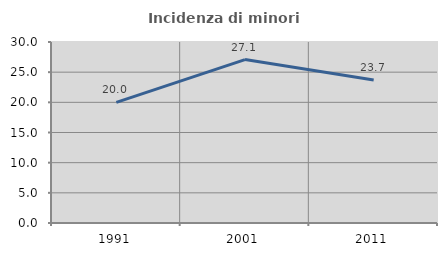
| Category | Incidenza di minori stranieri |
|---|---|
| 1991.0 | 20 |
| 2001.0 | 27.083 |
| 2011.0 | 23.704 |